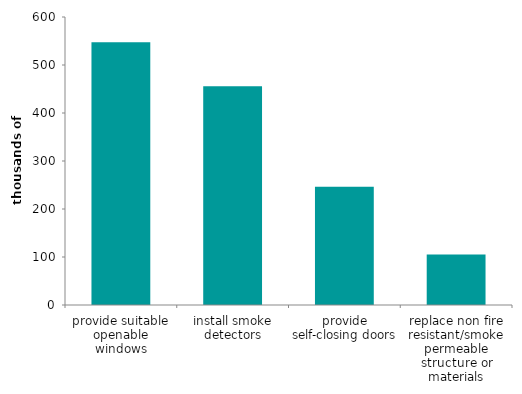
| Category | Series 0 |
|---|---|
| provide suitable openable windows | 547.279 |
| install smoke detectors | 455.733 |
| provide self-closing doors | 246.28 |
| replace non fire resistant/smoke permeable structure or materials | 105.283 |